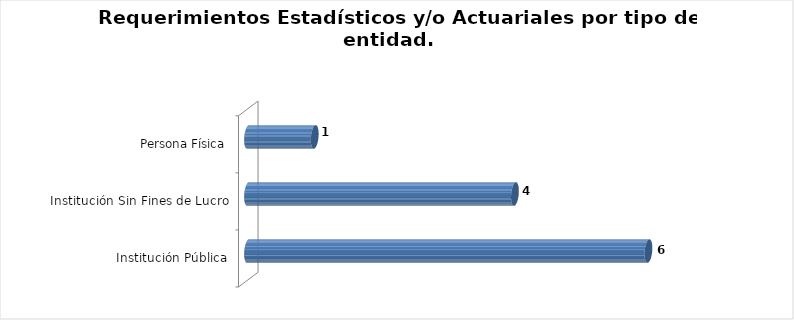
| Category | Total |
|---|---|
| Institución Pública | 6 |
| Institución Sin Fines de Lucro | 4 |
| Persona Física | 1 |